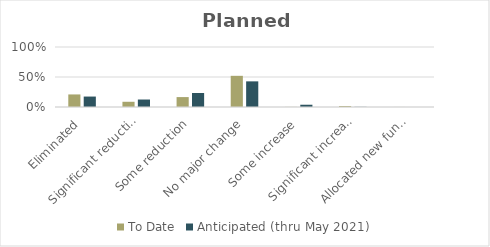
| Category | To Date | Anticipated (thru May 2021) |
|---|---|---|
| Eliminated | 0.209 | 0.174 |
| Significant reduction | 0.087 | 0.125 |
| Some reduction | 0.165 | 0.233 |
| No major change | 0.52 | 0.427 |
| Some increase | 0.002 | 0.038 |
| Significant increase | 0.016 | 0.003 |
| Allocated new funding | 0.001 | 0.001 |